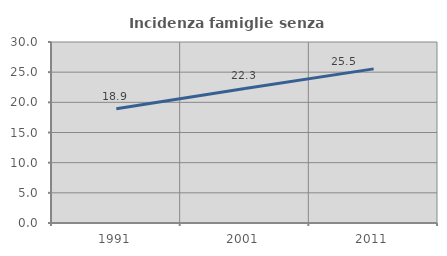
| Category | Incidenza famiglie senza nuclei |
|---|---|
| 1991.0 | 18.942 |
| 2001.0 | 22.3 |
| 2011.0 | 25.546 |